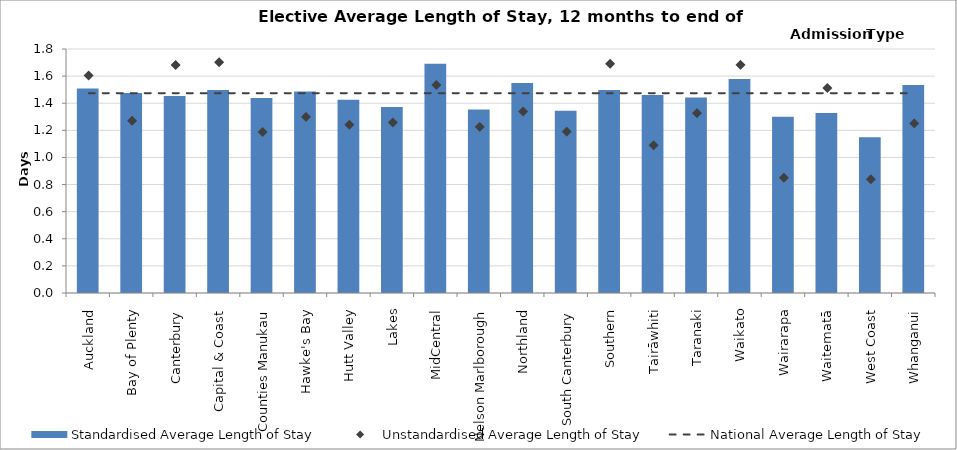
| Category | Standardised Average Length of Stay |
|---|---|
| Auckland | 1.509 |
| Bay of Plenty | 1.475 |
| Canterbury | 1.453 |
| Capital & Coast | 1.497 |
| Counties Manukau | 1.439 |
| Hawke's Bay | 1.487 |
| Hutt Valley | 1.426 |
| Lakes | 1.372 |
| MidCentral | 1.691 |
| Nelson Marlborough | 1.353 |
| Northland | 1.549 |
| South Canterbury | 1.345 |
| Southern | 1.497 |
| Tairāwhiti | 1.46 |
| Taranaki | 1.442 |
| Waikato | 1.578 |
| Wairarapa | 1.299 |
| Waitematā | 1.328 |
| West Coast | 1.148 |
| Whanganui | 1.534 |